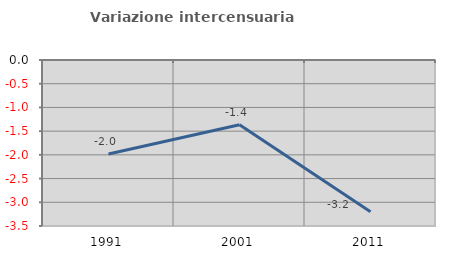
| Category | Variazione intercensuaria annua |
|---|---|
| 1991.0 | -1.982 |
| 2001.0 | -1.366 |
| 2011.0 | -3.198 |